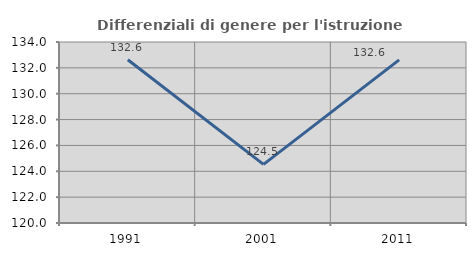
| Category | Differenziali di genere per l'istruzione superiore |
|---|---|
| 1991.0 | 132.623 |
| 2001.0 | 124.537 |
| 2011.0 | 132.615 |